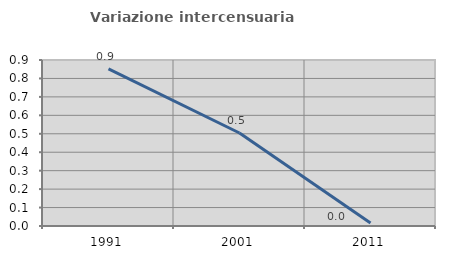
| Category | Variazione intercensuaria annua |
|---|---|
| 1991.0 | 0.852 |
| 2001.0 | 0.504 |
| 2011.0 | 0.016 |